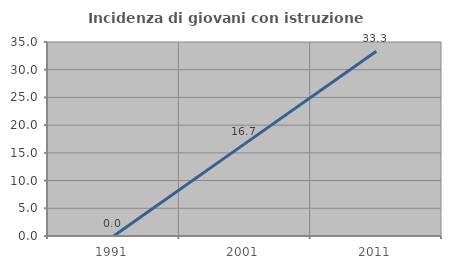
| Category | Incidenza di giovani con istruzione universitaria |
|---|---|
| 1991.0 | 0 |
| 2001.0 | 16.667 |
| 2011.0 | 33.333 |